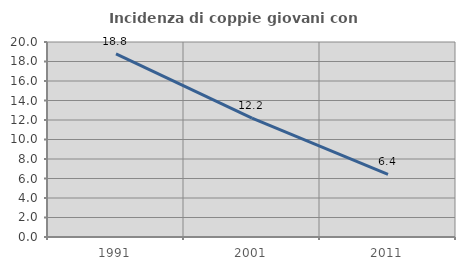
| Category | Incidenza di coppie giovani con figli |
|---|---|
| 1991.0 | 18.771 |
| 2001.0 | 12.186 |
| 2011.0 | 6.427 |